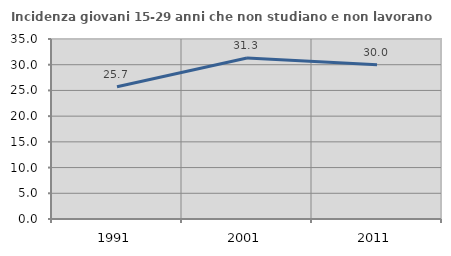
| Category | Incidenza giovani 15-29 anni che non studiano e non lavorano  |
|---|---|
| 1991.0 | 25.714 |
| 2001.0 | 31.294 |
| 2011.0 | 29.975 |